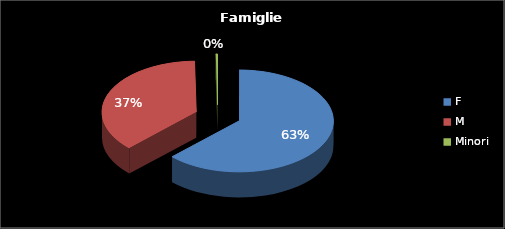
| Category | Series 0 |
|---|---|
| F | 428 |
| M | 254 |
| Minori | 2 |